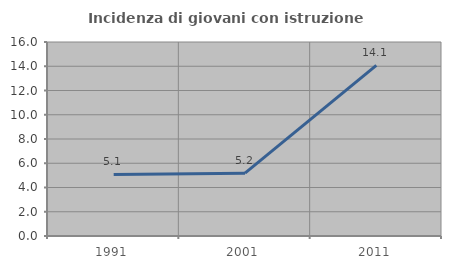
| Category | Incidenza di giovani con istruzione universitaria |
|---|---|
| 1991.0 | 5.079 |
| 2001.0 | 5.181 |
| 2011.0 | 14.074 |